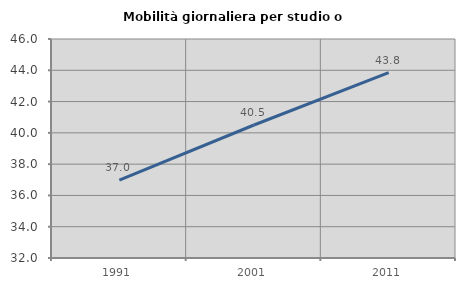
| Category | Mobilità giornaliera per studio o lavoro |
|---|---|
| 1991.0 | 36.975 |
| 2001.0 | 40.502 |
| 2011.0 | 43.845 |